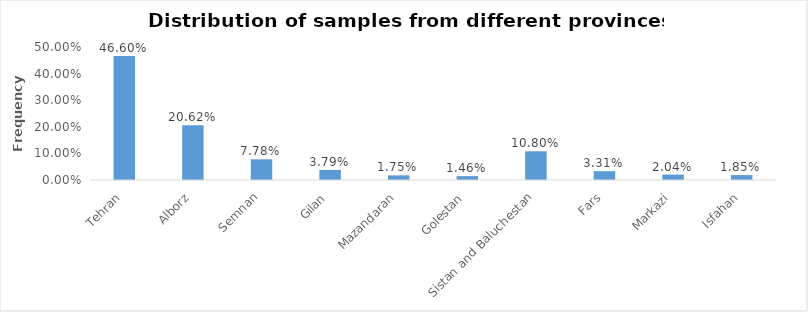
| Category | Samples collected from different provinces of Iran |
|---|---|
| Tehran | 0.466 |
| Alborz | 0.206 |
| Semnan | 0.078 |
| Gilan | 0.038 |
| Mazandaran | 0.018 |
| Golestan | 0.015 |
| Sistan and Baluchestan | 0.108 |
| Fars | 0.033 |
| Markazi | 0.02 |
| Isfahan | 0.018 |